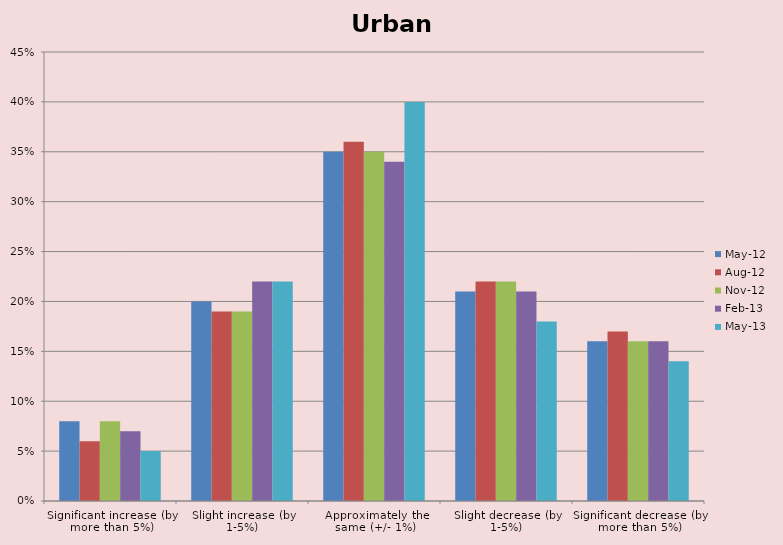
| Category | May-12 | Aug-12 | Nov-12 | Feb-13 | May-13 |
|---|---|---|---|---|---|
| Significant increase (by more than 5%) | 0.08 | 0.06 | 0.08 | 0.07 | 0.05 |
| Slight increase (by 1-5%) | 0.2 | 0.19 | 0.19 | 0.22 | 0.22 |
| Approximately the same (+/- 1%) | 0.35 | 0.36 | 0.35 | 0.34 | 0.4 |
| Slight decrease (by 1-5%) | 0.21 | 0.22 | 0.22 | 0.21 | 0.18 |
| Significant decrease (by more than 5%) | 0.16 | 0.17 | 0.16 | 0.16 | 0.14 |